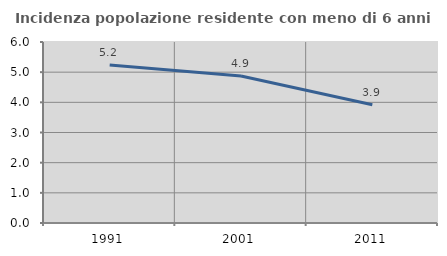
| Category | Incidenza popolazione residente con meno di 6 anni |
|---|---|
| 1991.0 | 5.234 |
| 2001.0 | 4.875 |
| 2011.0 | 3.922 |